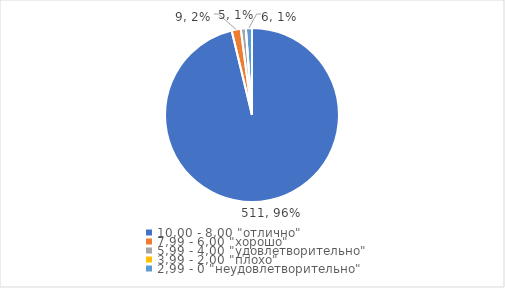
| Category | Series 0 | Series 1 |
|---|---|---|
| 10,00 - 8,00 "отлично" | 511 | 0.962 |
| 7,99 - 6,00 "хорошо" | 9 | 0.017 |
| 5,99 - 4,00 "удовлетворительно" | 5 | 0.009 |
| 3,99 - 2,00 "плохо" | 0 | 0 |
| 2,99 - 0 "неудовлетворительно" | 6 | 0.011 |